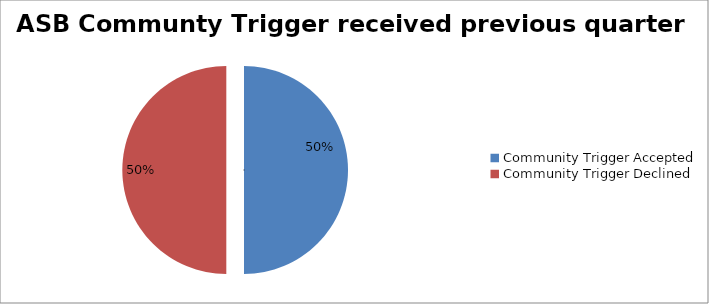
| Category | Series 0 |
|---|---|
| Community Trigger Accepted | 2 |
| Community Trigger Declined | 2 |